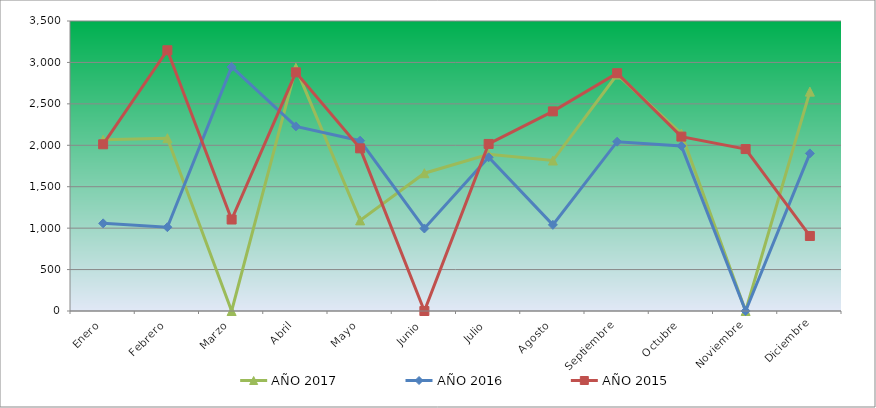
| Category | AÑO 2017 | AÑO 2016 | AÑO 2015 |
|---|---|---|---|
| Enero | 2065.531 | 1057.622 | 2011.954 |
| Febrero | 2085.258 | 1011.415 | 3146.826 |
| Marzo | 0 | 2945.67 | 1103.995 |
| Abril | 2934.688 | 2228.193 | 2880.613 |
| Mayo | 1093.723 | 2055.706 | 1962.945 |
| Junio | 1662.847 | 996.013 | 0 |
| Julio | 1892.394 | 1854.916 | 2016.275 |
| Agosto | 1816.088 | 1039.652 | 2409.189 |
| Septiembre | 2853.355 | 2043.366 | 2869.827 |
| Octubre | 2141.33 | 1992.025 | 2104.813 |
| Noviembre | 0 | 0 | 1954.303 |
| Diciembre | 2647.625 | 1902.179 | 905.379 |